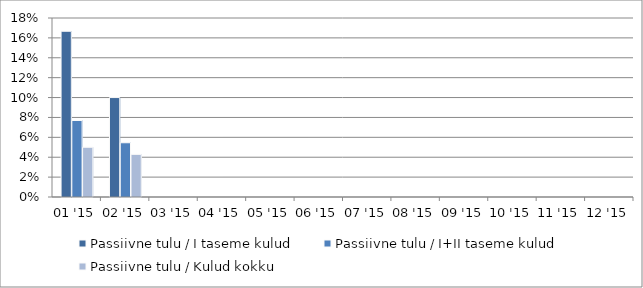
| Category | Passiivne tulu / I taseme kulud | Passiivne tulu / I+II taseme kulud | Passiivne tulu / Kulud kokku |
|---|---|---|---|
| 2015-01-31 | 0.167 | 0.077 | 0.05 |
| 2015-02-28 | 0.1 | 0.055 | 0.043 |
| 2015-03-31 | 0 | 0 | 0 |
| 2015-04-30 | 0 | 0 | 0 |
| 2015-05-31 | 0 | 0 | 0 |
| 2015-06-30 | 0 | 0 | 0 |
| 2015-07-31 | 0 | 0 | 0 |
| 2015-08-31 | 0 | 0 | 0 |
| 2015-09-30 | 0 | 0 | 0 |
| 2015-10-31 | 0 | 0 | 0 |
| 2015-11-30 | 0 | 0 | 0 |
| 2015-12-31 | 0 | 0 | 0 |